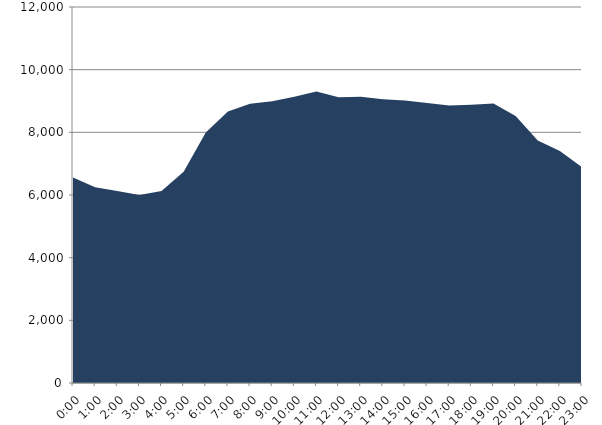
| Category | Series 0 | Series 1 |
|---|---|---|
| 2020-09-16 |  | 6556.32 |
| 2020-09-16 01:00:00 |  | 6248.629 |
| 2020-09-16 02:00:00 |  | 6129.996 |
| 2020-09-16 03:00:00 |  | 5999.209 |
| 2020-09-16 04:00:00 |  | 6126.126 |
| 2020-09-16 05:00:00 |  | 6741.5 |
| 2020-09-16 06:00:00 |  | 7996.11 |
| 2020-09-16 07:00:00 |  | 8668.557 |
| 2020-09-16 08:00:00 |  | 8913.16 |
| 2020-09-16 09:00:00 |  | 8993.894 |
| 2020-09-16 10:00:00 |  | 9138.475 |
| 2020-09-16 11:00:00 |  | 9301.722 |
| 2020-09-16 12:00:00 |  | 9120.599 |
| 2020-09-16 13:00:00 |  | 9135.926 |
| 2020-09-16 14:00:00 |  | 9059.382 |
| 2020-09-16 15:00:00 |  | 9014.441 |
| 2020-09-16 16:00:00 |  | 8939.985 |
| 2020-09-16 17:00:00 |  | 8860.211 |
| 2020-09-16 18:00:00 |  | 8883.75 |
| 2020-09-16 19:00:00 |  | 8921.458 |
| 2020-09-16 20:00:00 |  | 8523.074 |
| 2020-09-16 21:00:00 |  | 7738.984 |
| 2020-09-16 22:00:00 |  | 7402.31 |
| 2020-09-16 23:00:00 |  | 6888.755 |